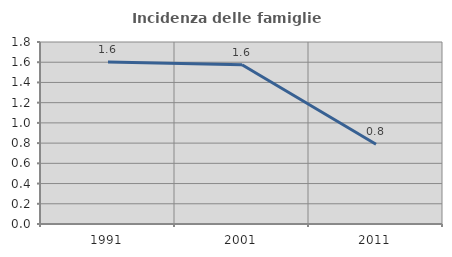
| Category | Incidenza delle famiglie numerose |
|---|---|
| 1991.0 | 1.601 |
| 2001.0 | 1.575 |
| 2011.0 | 0.788 |